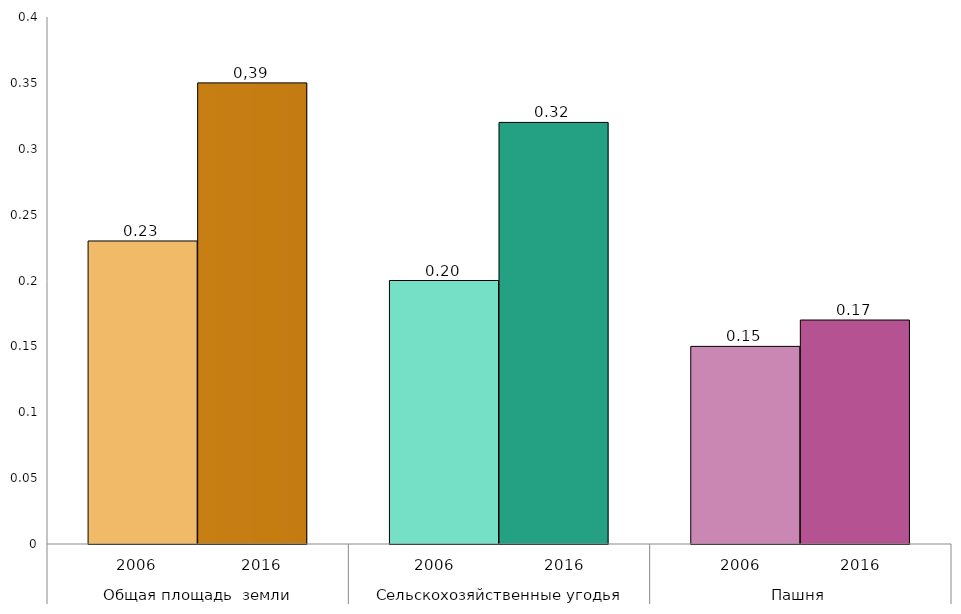
| Category | Series 0 | Series 1 |
|---|---|---|
| 0 | 0.23 | 0.35 |
| 1 | 0.2 | 0.32 |
| 2 | 0.15 | 0.17 |